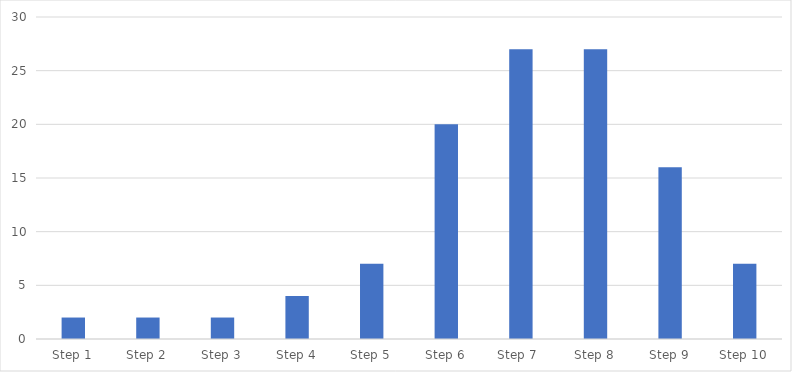
| Category | Number of Responses |
|---|---|
| Step 1 | 2 |
| Step 2 | 2 |
| Step 3 | 2 |
| Step 4 | 4 |
| Step 5 | 7 |
| Step 6 | 20 |
| Step 7  | 27 |
| Step 8 | 27 |
| Step 9 | 16 |
| Step 10 | 7 |